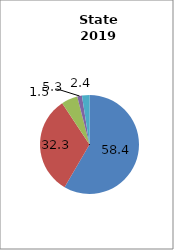
| Category | Arkansas |
|---|---|
| White | 58.408 |
| Black | 32.288 |
| Hispanic | 5.313 |
| Two or More Races | 1.544 |
| All Other1 | 2.447 |